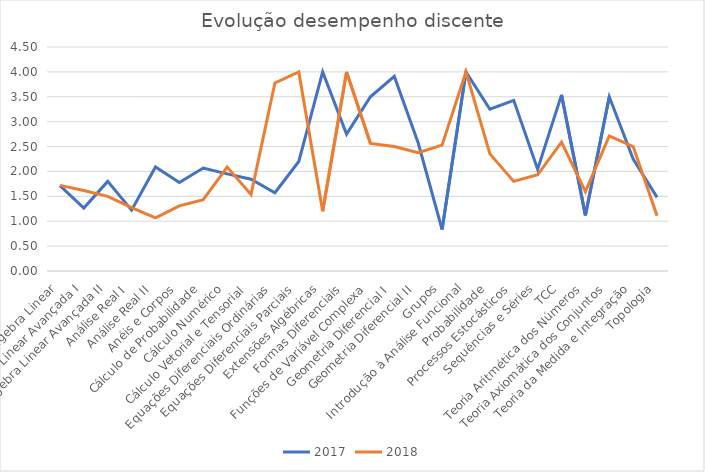
| Category | 2017 | 2018 |
|---|---|---|
| Álgebra Linear | 1.715 | 1.72 |
| Álgebra Linear Avançada I | 1.263 | 1.618 |
| Álgebra Linear Avançada II | 1.8 | 1.5 |
| Análise Real I | 1.222 | 1.271 |
| Análise Real II | 2.091 | 1.067 |
| Anéis e Corpos | 1.778 | 1.308 |
| Cálculo de Probabilidade | 2.068 | 1.435 |
| Cálculo Numérico | 1.951 | 2.087 |
| Cálculo Vetorial e Tensorial | 1.845 | 1.536 |
| Equações Diferenciais Ordinárias | 1.571 | 3.778 |
| Equações Diferenciais Parciais | 2.2 | 4 |
| Extensões Algébricas | 4 | 1.2 |
| Formas Diferenciais | 2.75 | 4 |
| Funções de Variável Complexa | 3.5 | 2.562 |
| Geometria Diferencial I | 3.909 | 2.5 |
| Geometria Diferencial II | 2.571 | 2.375 |
| Grupos | 0.833 | 2.529 |
| Introdução à Análise Funcional | 4 | 4 |
| Probabilidade | 3.25 | 2.353 |
| Processos Estocásticos | 3.429 | 1.8 |
| Sequências e Séries | 2.044 | 1.933 |
| TCC | 3.538 | 2.587 |
| Teoria Aritmética dos Números | 1.118 | 1.593 |
| Teoria Axiomática dos Conjuntos | 3.5 | 2.714 |
| Teoria da Medida e Integração | 2.25 | 2.5 |
| Topologia | 1.478 | 1.111 |